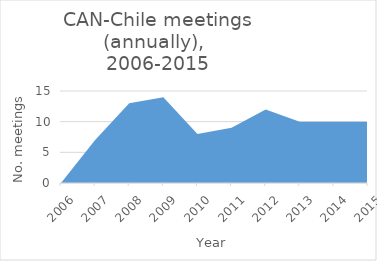
| Category | Number of meetings |
|---|---|
| 2006.0 | 0 |
| 2007.0 | 7 |
| 2008.0 | 13 |
| 2009.0 | 14 |
| 2010.0 | 8 |
| 2011.0 | 9 |
| 2012.0 | 12 |
| 2013.0 | 10 |
| 2014.0 | 10 |
| 2015.0 | 10 |